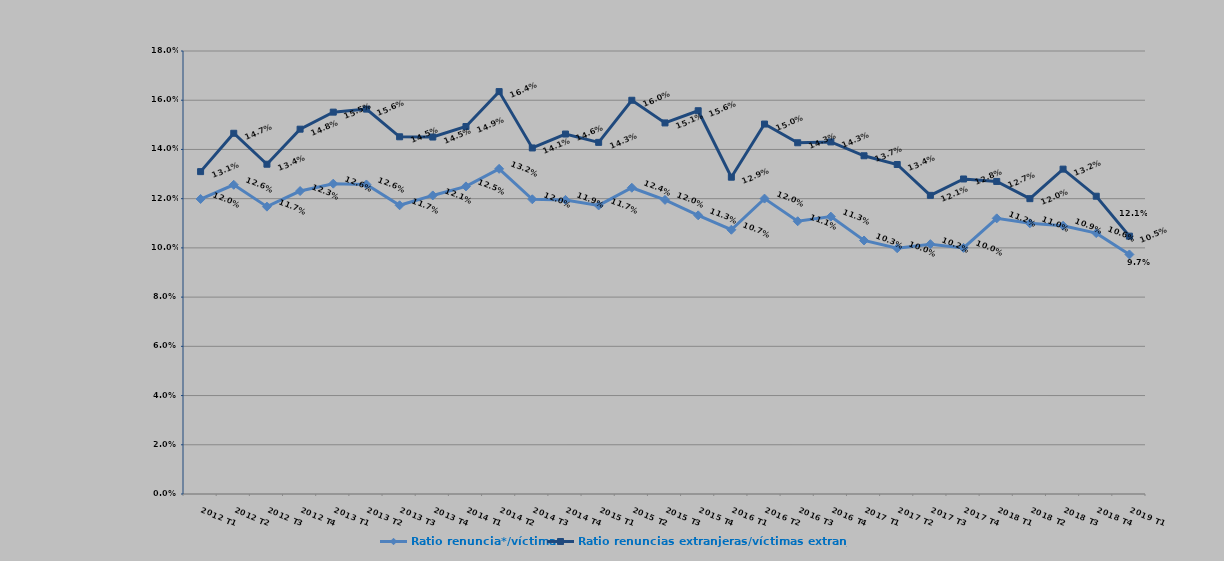
| Category | Ratio renuncia*/víctima | Ratio renuncias extranjeras/víctimas extranjeras |
|---|---|---|
| 2012 T1 | 0.12 | 0.131 |
| 2012 T2 | 0.126 | 0.147 |
| 2012 T3 | 0.117 | 0.134 |
| 2012 T4 | 0.123 | 0.148 |
| 2013 T1 | 0.126 | 0.155 |
| 2013 T2 | 0.126 | 0.156 |
| 2013 T3 | 0.117 | 0.145 |
| 2013 T4 | 0.121 | 0.145 |
| 2014 T1 | 0.125 | 0.149 |
| 2014 T2 | 0.132 | 0.164 |
| 2014 T3 | 0.12 | 0.141 |
| 2014 T4 | 0.119 | 0.146 |
| 2015 T1 | 0.117 | 0.143 |
| 2015 T2 | 0.124 | 0.16 |
| 2015 T3 | 0.12 | 0.151 |
| 2015 T4 | 0.113 | 0.156 |
| 2016 T1 | 0.107 | 0.129 |
| 2016 T2 | 0.12 | 0.15 |
| 2016 T3 | 0.111 | 0.143 |
| 2016 T4 | 0.113 | 0.143 |
| 2017 T1 | 0.103 | 0.137 |
| 2017 T2 | 0.1 | 0.134 |
| 2017 T3 | 0.102 | 0.121 |
| 2017 T4 | 0.1 | 0.128 |
| 2018 T1 | 0.112 | 0.127 |
| 2018 T2 | 0.11 | 0.12 |
| 2018 T3 | 0.109 | 0.132 |
| 2018 T4 | 0.106 | 0.121 |
| 2019 T1 | 0.097 | 0.105 |